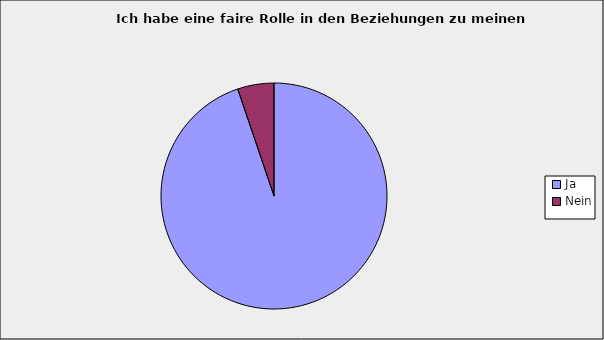
| Category | Series 0 |
|---|---|
| Ja | 0.948 |
| Nein | 0.052 |